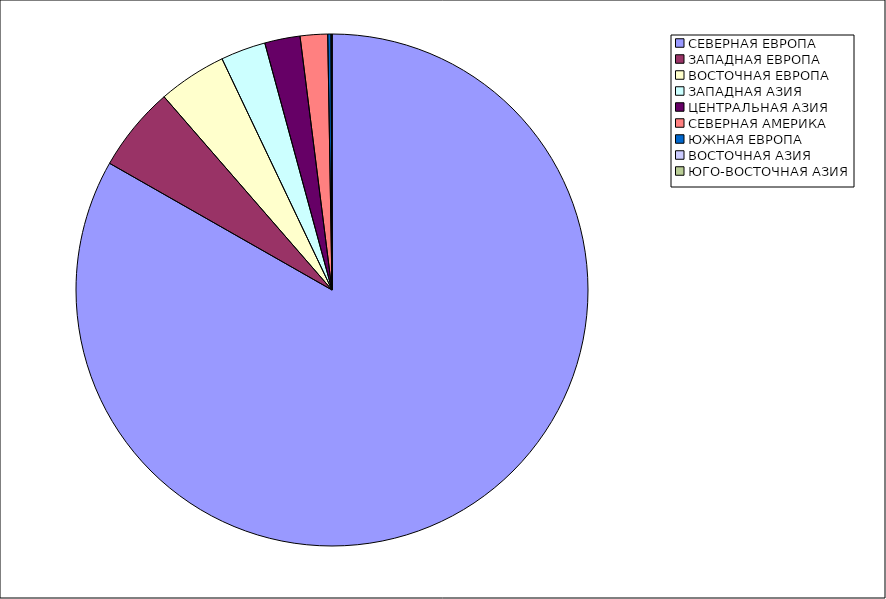
| Category | Оборот |
|---|---|
| СЕВЕРНАЯ ЕВРОПА | 83.24 |
| ЗАПАДНАЯ ЕВРОПА | 5.373 |
| ВОСТОЧНАЯ ЕВРОПА | 4.32 |
| ЗАПАДНАЯ АЗИЯ | 2.838 |
| ЦЕНТРАЛЬНАЯ АЗИЯ | 2.233 |
| СЕВЕРНАЯ АМЕРИКА | 1.73 |
| ЮЖНАЯ ЕВРОПА | 0.204 |
| ВОСТОЧНАЯ АЗИЯ | 0.063 |
| ЮГО-ВОСТОЧНАЯ АЗИЯ | 0 |